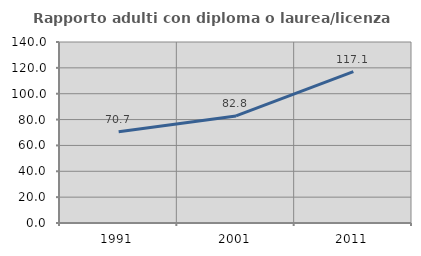
| Category | Rapporto adulti con diploma o laurea/licenza media  |
|---|---|
| 1991.0 | 70.652 |
| 2001.0 | 82.787 |
| 2011.0 | 117.117 |